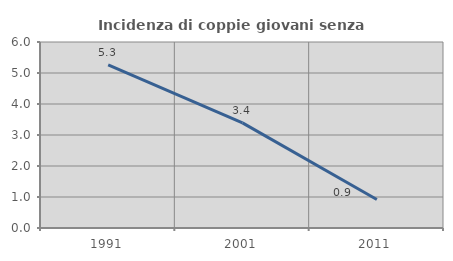
| Category | Incidenza di coppie giovani senza figli |
|---|---|
| 1991.0 | 5.263 |
| 2001.0 | 3.39 |
| 2011.0 | 0.917 |